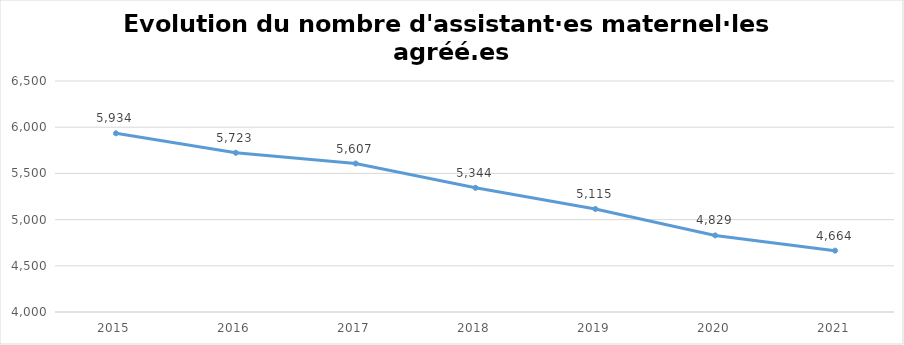
| Category | Series 0 |
|---|---|
| 2015.0 | 5934 |
| 2016.0 | 5723 |
| 2017.0 | 5607 |
| 2018.0 | 5344 |
| 2019.0 | 5115 |
| 2020.0 | 4829 |
| 2021.0 | 4664 |